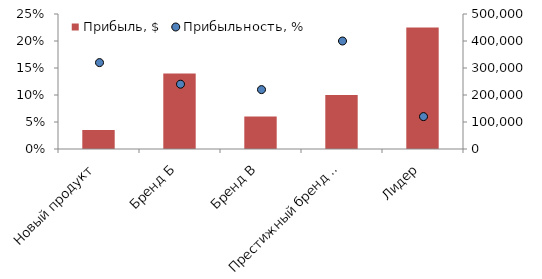
| Category | Прибыль, $ |
|---|---|
| Новый продукт | 70000 |
| Бренд Б | 280000 |
| Бренд В | 120000 |
| Престижный бренд рынка | 200000 |
| Лидер | 450000 |